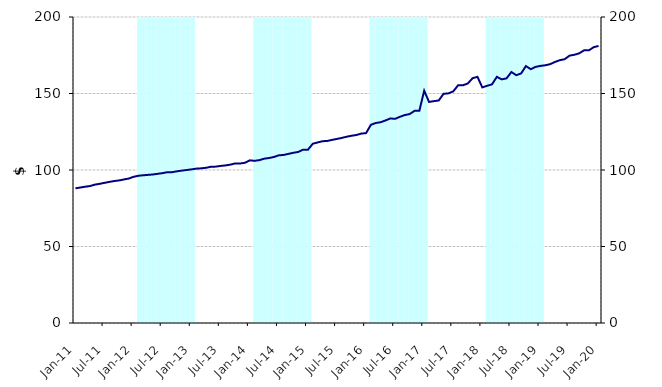
| Category | Series 1 |
|---|---|
| 0 | 0 |
| 1900-01-01 | 0 |
| 1900-01-02 | 0 |
| 1900-01-03 | 0 |
| 1900-01-04 | 0 |
| 1900-01-05 | 0 |
| 1900-01-06 | 0 |
| 1900-01-07 | 0 |
| 1900-01-08 | 0 |
| 1900-01-09 | 0 |
| 1900-01-10 | 0 |
| 1900-01-11 | 0 |
| 1900-01-12 | 0 |
| 1900-01-13 | 200000000 |
| 1900-01-14 | 200000000 |
| 1900-01-15 | 200000000 |
| 1900-01-16 | 200000000 |
| 1900-01-17 | 200000000 |
| 1900-01-18 | 200000000 |
| 1900-01-19 | 200000000 |
| 1900-01-20 | 200000000 |
| 1900-01-21 | 200000000 |
| 1900-01-22 | 200000000 |
| 1900-01-23 | 200000000 |
| 1900-01-24 | 200000000 |
| 1900-01-25 | 0 |
| 1900-01-26 | 0 |
| 1900-01-27 | 0 |
| 1900-01-28 | 0 |
| 1900-01-29 | 0 |
| 1900-01-30 | 0 |
| 1900-01-31 | 0 |
| 1900-02-01 | 0 |
| 1900-02-02 | 0 |
| 1900-02-03 | 0 |
| 1900-02-04 | 0 |
| 1900-02-05 | 0 |
| 1900-02-06 | 200000000 |
| 1900-02-07 | 200000000 |
| 1900-02-08 | 200000000 |
| 1900-02-09 | 200000000 |
| 1900-02-10 | 200000000 |
| 1900-02-11 | 200000000 |
| 1900-02-12 | 200000000 |
| 1900-02-13 | 200000000 |
| 1900-02-14 | 200000000 |
| 1900-02-15 | 200000000 |
| 1900-02-16 | 200000000 |
| 1900-02-17 | 200000000 |
| 1900-02-18 | 0 |
| 1900-02-19 | 0 |
| 1900-02-20 | 0 |
| 1900-02-21 | 0 |
| 1900-02-22 | 0 |
| 1900-02-23 | 0 |
| 1900-02-24 | 0 |
| 1900-02-25 | 0 |
| 1900-02-26 | 0 |
| 1900-02-27 | 0 |
| 1900-02-28 | 0 |
| 1900-02-28 | 0 |
| 1900-03-01 | 200000000 |
| 1900-03-02 | 200000000 |
| 1900-03-03 | 200000000 |
| 1900-03-04 | 200000000 |
| 1900-03-05 | 200000000 |
| 1900-03-06 | 200000000 |
| 1900-03-07 | 200000000 |
| 1900-03-08 | 200000000 |
| 1900-03-09 | 200000000 |
| 1900-03-10 | 200000000 |
| 1900-03-11 | 200000000 |
| 1900-03-12 | 200000000 |
| 1900-03-13 | 0 |
| 1900-03-14 | 0 |
| 1900-03-15 | 0 |
| 1900-03-16 | 0 |
| 1900-03-17 | 0 |
| 1900-03-18 | 0 |
| 1900-03-19 | 0 |
| 1900-03-20 | 0 |
| 1900-03-21 | 0 |
| 1900-03-22 | 0 |
| 1900-03-23 | 0 |
| 1900-03-24 | 0 |
| 1900-03-25 | 200000000 |
| 1900-03-26 | 200000000 |
| 1900-03-27 | 200000000 |
| 1900-03-28 | 200000000 |
| 1900-03-29 | 200000000 |
| 1900-03-30 | 200000000 |
| 1900-03-31 | 200000000 |
| 1900-04-01 | 200000000 |
| 1900-04-02 | 200000000 |
| 1900-04-03 | 200000000 |
| 1900-04-04 | 200000000 |
| 1900-04-05 | 200000000 |
| 1900-04-06 | 0 |
| 1900-04-07 | 0 |
| 1900-04-08 | 0 |
| 1900-04-09 | 0 |
| 1900-04-10 | 0 |
| 1900-04-11 | 0 |
| 1900-04-12 | 0 |
| 1900-04-13 | 0 |
| 1900-04-14 | 0 |
| 1900-04-15 | 0 |
| 1900-04-16 | 0 |
| 1900-04-17 | 0 |